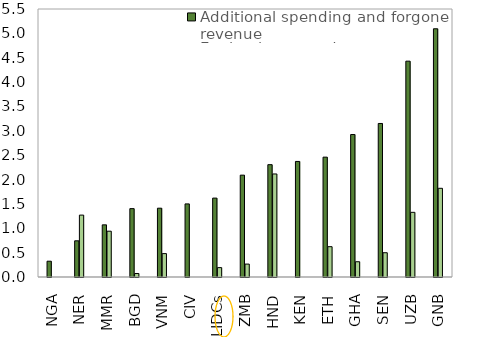
| Category | Additional spending and forgone revenue | Equity, loans, and guarantees |
|---|---|---|
| NGA | 0.324 | 0 |
| NER | 0.743 | 1.27 |
| MMR | 1.07 | 0.94 |
| BGD | 1.403 | 0.072 |
| VNM | 1.412 | 0.48 |
| CIV | 1.5 | 0 |
| LIDCs | 1.619 | 0.193 |
| ZMB | 2.09 | 0.265 |
| HND | 2.305 | 2.115 |
| KEN | 2.372 | 0 |
| ETH | 2.46 | 0.622 |
| GHA | 2.924 | 0.313 |
| SEN | 3.151 | 0.498 |
| UZB | 4.429 | 1.327 |
| GNB | 5.094 | 1.82 |